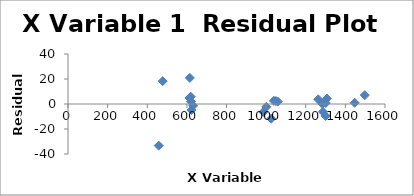
| Category | Series 0 |
|---|---|
| 1059.0 | 1.94 |
| 1049.0 | 2.349 |
| 1039.0 | 2.531 |
| 1026.0 | -11.733 |
| 1001.0 | -2.284 |
| 986.0 | -6.347 |
| 1447.0 | 0.997 |
| 458.0 | -33.296 |
| 1263.0 | 3.78 |
| 1283.0 | 0.105 |
| 1301.0 | 0.781 |
| 1287.0 | -6.272 |
| 1300.0 | -9.504 |
| 1307.0 | 4.345 |
| 632.0 | -1.34 |
| 621.0 | 1.876 |
| 623.0 | -4.808 |
| 620.0 | 5.789 |
| 613.0 | 4.832 |
| 615.0 | 20.883 |
| 478.0 | 18.301 |
| 1498.0 | 7.076 |